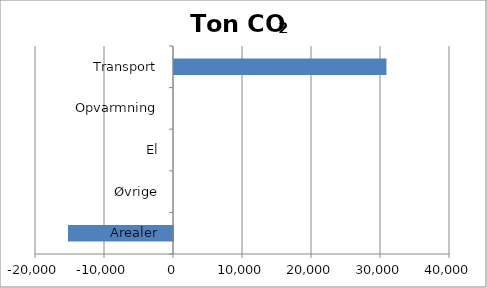
| Category | Series 0 |
|---|---|
| Arealer | -15221.79 |
| Øvrige | 0 |
| El | 0 |
| Opvarmning | 0 |
| Transport | 30790.918 |